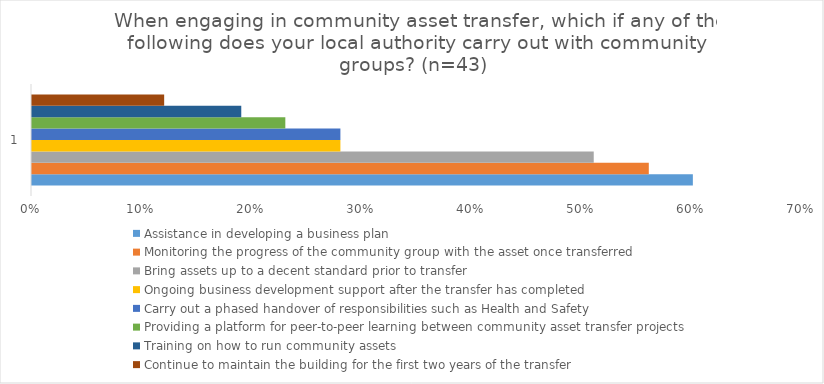
| Category | Assistance in developing a business plan | Monitoring the progress of the community group with the asset once transferred | Bring assets up to a decent standard prior to transfer | Ongoing business development support after the transfer has completed | Carry out a phased handover of responsibilities such as Health and Safety | Providing a platform for peer-to-peer learning between community asset transfer projects | Training on how to run community assets | Continue to maintain the building for the first two years of the transfer |
|---|---|---|---|---|---|---|---|---|
| 0 | 0.6 | 0.56 | 0.51 | 0.28 | 0.28 | 0.23 | 0.19 | 0.12 |